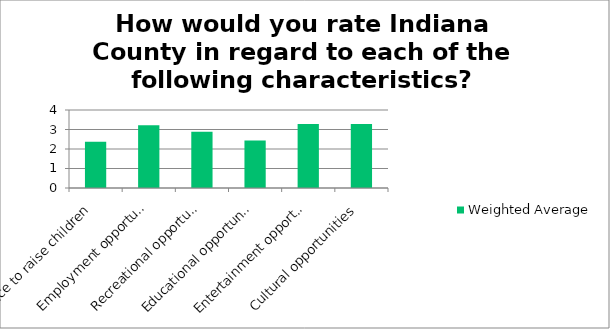
| Category | Weighted Average |
|---|---|
| Place to raise children | 2.37 |
| Employment opportunities | 3.22 |
| Recreational opportunities | 2.89 |
| Educational opportunities | 2.43 |
| Entertainment opportunities | 3.28 |
| Cultural opportunities | 3.28 |